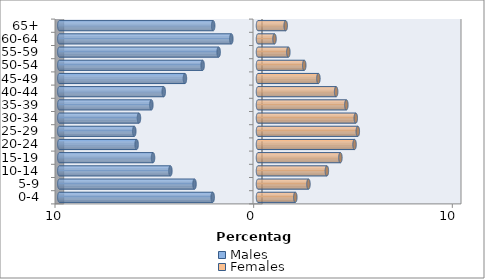
| Category | Males | Females |
|---|---|---|
| 0-4 | -2.281 | 1.878 |
| 5-9 | -3.196 | 2.54 |
| 10-14 | -4.41 | 3.467 |
| 15-19 | -5.284 | 4.147 |
| 20-24 | -6.11 | 4.86 |
| 25-29 | -6.228 | 5.024 |
| 30-34 | -5.993 | 4.922 |
| 35-39 | -5.369 | 4.448 |
| 40-44 | -4.745 | 3.933 |
| 45-49 | -3.678 | 3.04 |
| 50-54 | -2.787 | 2.328 |
| 55-59 | -1.981 | 1.528 |
| 60-64 | -1.342 | 0.83 |
| 65+ | -2.256 | 1.394 |